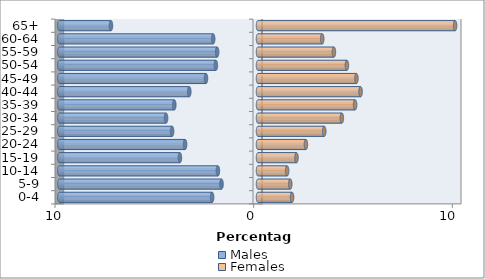
| Category | Males | Females |
|---|---|---|
| 0-4 | -2.309 | 1.714 |
| 5-9 | -1.837 | 1.624 |
| 10-14 | -2.018 | 1.466 |
| 15-19 | -3.93 | 1.937 |
| 20-24 | -3.669 | 2.411 |
| 25-29 | -4.323 | 3.334 |
| 30-34 | -4.627 | 4.221 |
| 35-39 | -4.213 | 4.887 |
| 40-44 | -3.458 | 5.164 |
| 45-49 | -2.618 | 4.955 |
| 50-54 | -2.12 | 4.476 |
| 55-59 | -2.057 | 3.821 |
| 60-64 | -2.255 | 3.233 |
| 65+ | -7.401 | 9.922 |